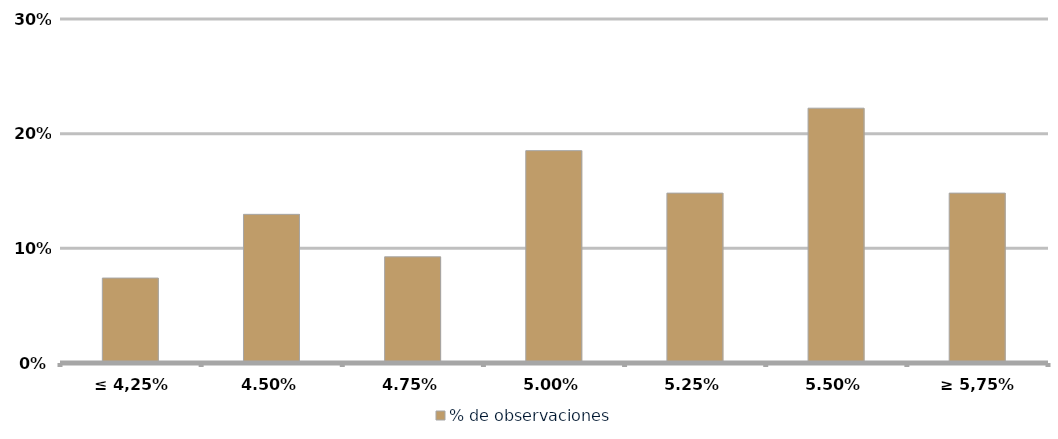
| Category | % de observaciones  |
|---|---|
| ≤ 4,25% | 0.074 |
| 4,50% | 0.13 |
| 4,75% | 0.093 |
| 5,00% | 0.185 |
| 5,25% | 0.148 |
| 5,50% | 0.222 |
| ≥ 5,75% | 0.148 |